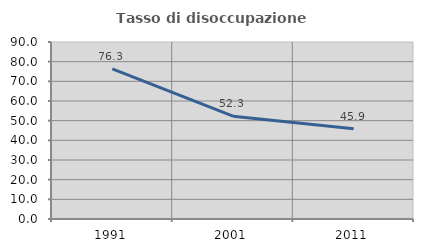
| Category | Tasso di disoccupazione giovanile  |
|---|---|
| 1991.0 | 76.316 |
| 2001.0 | 52.273 |
| 2011.0 | 45.946 |